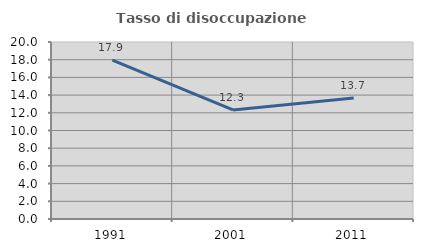
| Category | Tasso di disoccupazione giovanile  |
|---|---|
| 1991.0 | 17.949 |
| 2001.0 | 12.329 |
| 2011.0 | 13.684 |